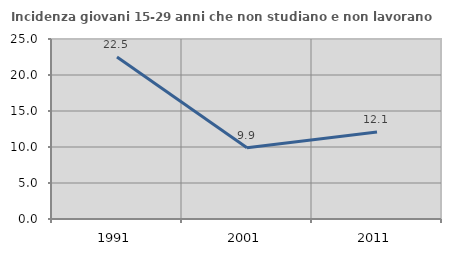
| Category | Incidenza giovani 15-29 anni che non studiano e non lavorano  |
|---|---|
| 1991.0 | 22.5 |
| 2001.0 | 9.895 |
| 2011.0 | 12.069 |